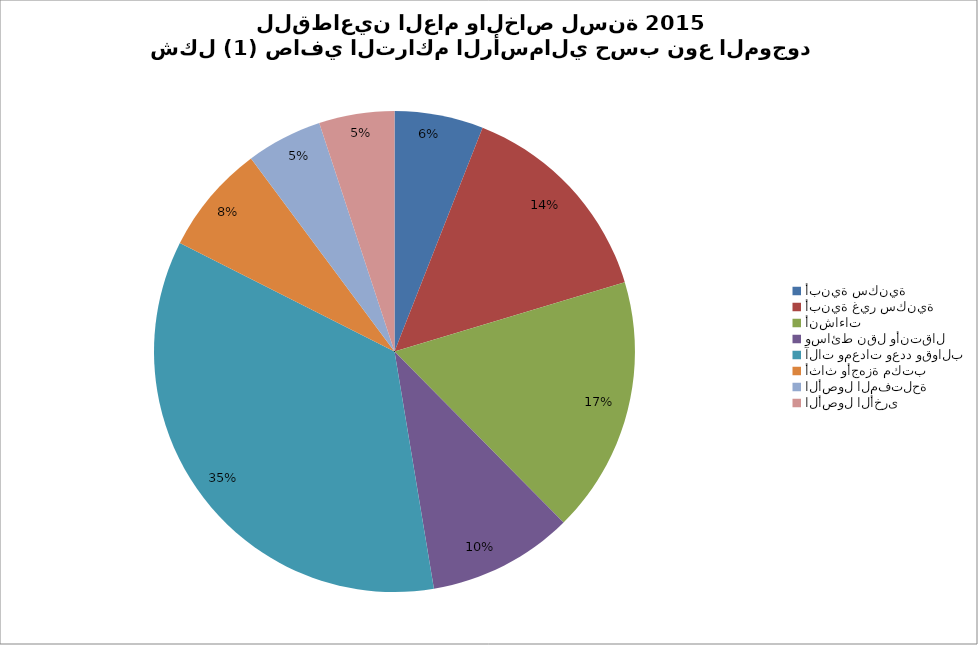
| Category | Series 0 |
|---|---|
| أبنية سكنية | 10664579.556 |
| أبنية غير سكنية | 25678226.856 |
| أنشاءات | 30816334.624 |
| وسائط نقل وأنتقال | 17480464.165 |
| آلات ومعدات وعدد وقوالب | 62652786.256 |
| أثاث وأجهزة مكتب | 13173977.002 |
| الأصول المفتلحة | 9125968.969 |
| الأصول الأخرى  | 9048515.853 |